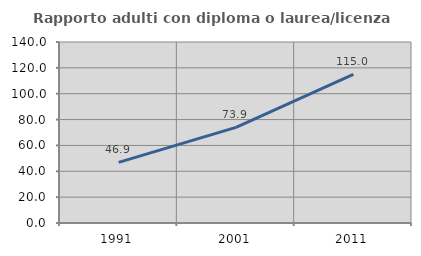
| Category | Rapporto adulti con diploma o laurea/licenza media  |
|---|---|
| 1991.0 | 46.888 |
| 2001.0 | 73.927 |
| 2011.0 | 114.966 |